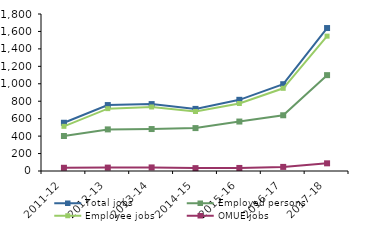
| Category | Total jobs | Employed persons | Employee jobs | OMUE jobs |
|---|---|---|---|---|
| 2011-12 | 553 | 401 | 512 | 37 |
| 2012-13 | 756 | 477 | 715 | 39 |
| 2013-14 | 767 | 481 | 734 | 41 |
| 2014-15 | 712 | 492 | 682 | 33 |
| 2015-16 | 816 | 567 | 774 | 35 |
| 2016-17 | 995 | 639 | 948 | 47 |
| 2017-18 | 1639 | 1099 | 1546 | 88 |